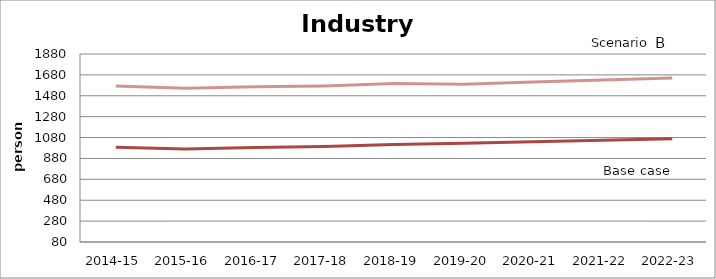
| Category | Series 0 | Series 1 |
|---|---|---|
| 2014-15 | 987.268 | 1574.333 |
| 2015-16 | 971.339 | 1552.631 |
| 2016-17 | 985.374 | 1565.3 |
| 2017-18 | 995.298 | 1574.355 |
| 2018-19 | 1012.417 | 1596.595 |
| 2019-20 | 1026.196 | 1590.097 |
| 2020-21 | 1039.91 | 1611.22 |
| 2021-22 | 1053.544 | 1630.906 |
| 2022-23 | 1068.105 | 1650.971 |